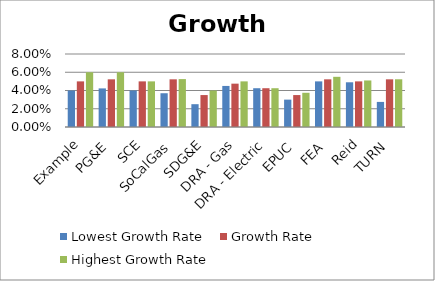
| Category | Lowest Growth Rate | Growth Rate | Highest Growth Rate |
|---|---|---|---|
| Example | 0.04 | 0.05 | 0.06 |
| PG&E | 0.042 | 0.052 | 0.06 |
| SCE | 0.04 | 0.05 | 0.05 |
| SoCalGas | 0.037 | 0.052 | 0.052 |
| SDG&E | 0.025 | 0.035 | 0.04 |
| DRA - Gas | 0.045 | 0.048 | 0.05 |
| DRA - Electric | 0.042 | 0.042 | 0.042 |
| EPUC | 0.03 | 0.035 | 0.038 |
| FEA | 0.05 | 0.052 | 0.055 |
| Reid | 0.049 | 0.05 | 0.051 |
| TURN | 0.028 | 0.052 | 0.052 |